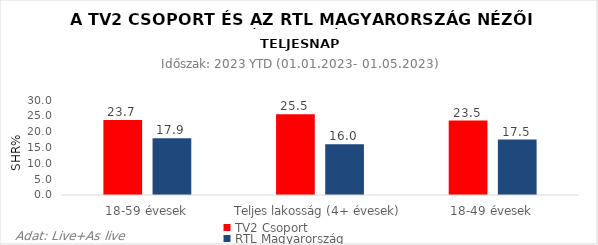
| Category | TV2 Csoport | RTL Magyarország |
|---|---|---|
| 18-59 évesek | 23.7 | 17.9 |
| Teljes lakosság (4+ évesek) | 25.5 | 16 |
| 18-49 évesek | 23.5 | 17.5 |